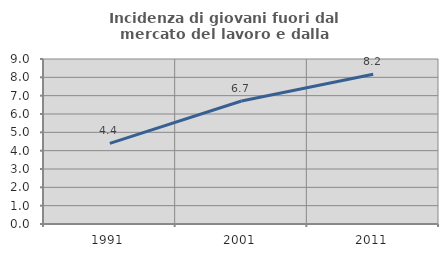
| Category | Incidenza di giovani fuori dal mercato del lavoro e dalla formazione  |
|---|---|
| 1991.0 | 4.4 |
| 2001.0 | 6.71 |
| 2011.0 | 8.167 |